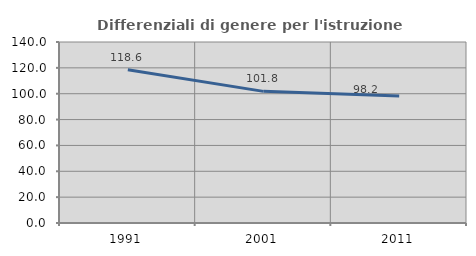
| Category | Differenziali di genere per l'istruzione superiore |
|---|---|
| 1991.0 | 118.597 |
| 2001.0 | 101.817 |
| 2011.0 | 98.21 |